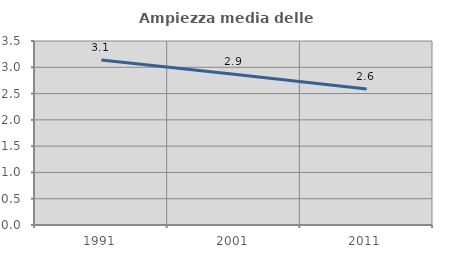
| Category | Ampiezza media delle famiglie |
|---|---|
| 1991.0 | 3.138 |
| 2001.0 | 2.866 |
| 2011.0 | 2.585 |